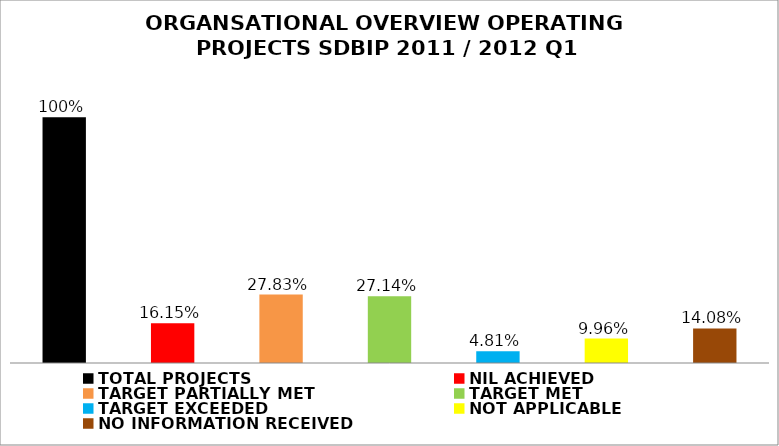
| Category | Series 0 |
|---|---|
| TOTAL PROJECTS | 1 |
| NIL ACHIEVED | 0.162 |
| TARGET PARTIALLY MET | 0.278 |
| TARGET MET | 0.271 |
| TARGET EXCEEDED | 0.048 |
| NOT APPLICABLE | 0.1 |
| NO INFORMATION RECEIVED | 0.141 |